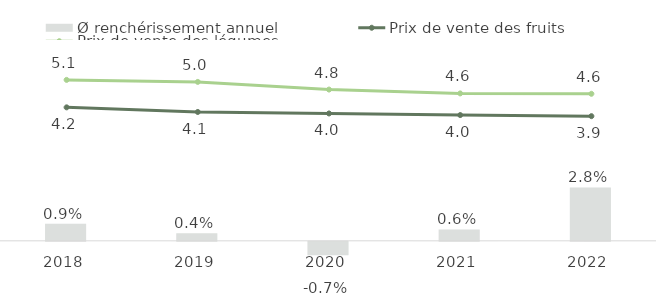
| Category | Ø renchérissement annuel |
|---|---|
| 2018.0 | 0.009 |
| 2019.0 | 0.004 |
| 2020.0 | -0.007 |
| 2021.0 | 0.006 |
| 2022.0 | 0.028 |